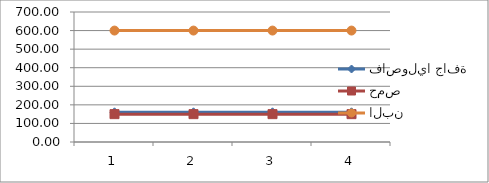
| Category | فاصوليا جافة | حمص | البن |
|---|---|---|---|
| 0 | 160 | 150 | 600 |
| 1 | 160 | 150 | 600 |
| 2 | 160 | 150 | 600 |
| 3 | 160 | 150 | 600 |